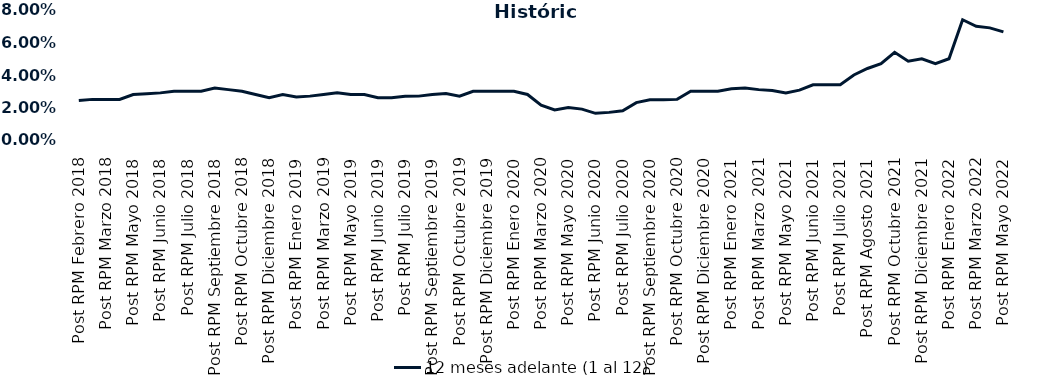
| Category | 12 meses adelante (1 al 12)  |
|---|---|
| Post RPM Febrero 2018 | 0.024 |
| Pre RPM Marzo 2018 | 0.025 |
| Post RPM Marzo 2018 | 0.025 |
| Pre RPM Mayo 2018 | 0.025 |
| Post RPM Mayo 2018 | 0.028 |
| Pre RPM Junio 2018 | 0.028 |
| Post RPM Junio 2018 | 0.029 |
| Pre RPM Julio 2018 | 0.03 |
| Post RPM Julio 2018 | 0.03 |
| Pre RPM Septiembre 2018 | 0.03 |
| Post RPM Septiembre 2018 | 0.032 |
| Pre RPM Octubre 2018 | 0.031 |
| Post RPM Octubre 2018 | 0.03 |
| Pre RPM Diciembre 2018 | 0.028 |
| Post RPM Diciembre 2018 | 0.026 |
| Pre RPM Enero 2019 | 0.028 |
| Post RPM Enero 2019 | 0.026 |
| Pre RPM Marzo 2019 | 0.027 |
| Post RPM Marzo 2019 | 0.028 |
| Pre RPM Mayo 2019 | 0.029 |
| Post RPM Mayo 2019 | 0.028 |
| Pre RPM Junio 2019 | 0.028 |
| Post RPM Junio 2019 | 0.026 |
| Pre RPM Julio 2019 | 0.026 |
| Post RPM Julio 2019 | 0.027 |
| Pre RPM Septiembre 2019 | 0.027 |
| Post RPM Septiembre 2019 | 0.028 |
| Pre RPM Octubre 2019 | 0.029 |
| Post RPM Octubre 2019 | 0.027 |
| Pre RPM Diciembre 2019 | 0.03 |
| Post RPM Diciembre 2019 | 0.03 |
| Pre RPM Enero 2020 | 0.03 |
| Post RPM Enero 2020 | 0.03 |
| Pre RPM Marzo 2020 | 0.028 |
| Post RPM Marzo 2020 | 0.022 |
| Pre RPM Mayo 2020 | 0.018 |
| Post RPM Mayo 2020 | 0.02 |
| Pre RPM Junio 2020 | 0.019 |
| Post RPM Junio 2020 | 0.016 |
| Pre RPM Julio 2020 | 0.017 |
| Post RPM Julio 2020 | 0.018 |
| Pre RPM Septiembre 2020 | 0.023 |
| Post RPM Septiembre 2020 | 0.025 |
| Pre RPM Octubre 2020 | 0.025 |
| Post RPM Octubre 2020 | 0.025 |
| Pre RPM Diciembre 2020 | 0.03 |
| Post RPM Diciembre 2020 | 0.03 |
| Pre RPM Enero 2021 | 0.03 |
| Post RPM Enero 2021 | 0.032 |
| Pre RPM Marzo 2021 | 0.032 |
| Post RPM Marzo 2021 | 0.031 |
| Pre RPM Mayo 2021 | 0.03 |
| Post RPM Mayo 2021 | 0.029 |
| Pre RPM Junio 2021 | 0.031 |
| Post RPM Junio 2021 | 0.034 |
| Pre RPM Julio 2021 | 0.034 |
| Post RPM Julio 2021 | 0.034 |
| Pre RPM Agosto 2021 | 0.04 |
| Post RPM Agosto 2021 | 0.044 |
| Pre RPM Octubre 2021 | 0.047 |
| Post RPM Octubre 2021 | 0.054 |
| Pre RPM Diciembre 2021 | 0.048 |
| Post RPM Diciembre 2021 | 0.05 |
| Pre RPM Enero 2022 | 0.047 |
| Post RPM Enero 2022 | 0.05 |
| Pre RPM Marzo 2022 | 0.074 |
| Post RPM Marzo 2022 | 0.07 |
| Pre RPM Mayo 2022 | 0.069 |
| Post RPM Mayo 2022 | 0.066 |